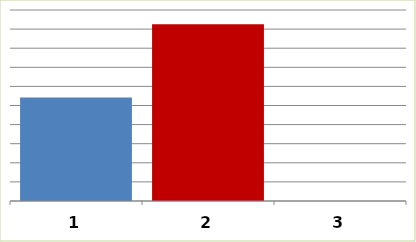
| Category | Series 0 |
|---|---|
| 0 | 108429155 |
| 1 | 185127669 |
| 2 | 0 |